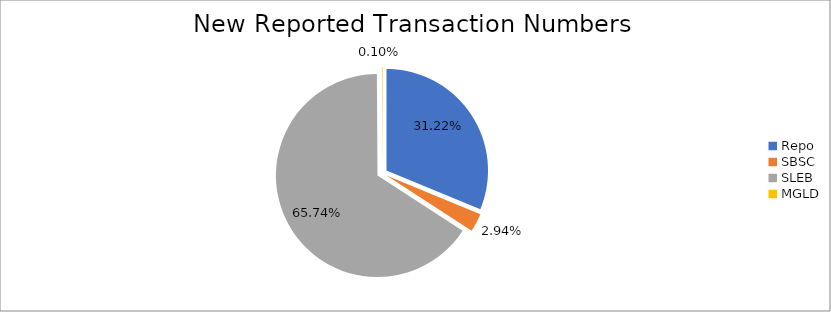
| Category | Series 0 |
|---|---|
| Repo | 384443 |
| SBSC | 36242 |
| SLEB | 809450 |
| MGLD | 1188 |